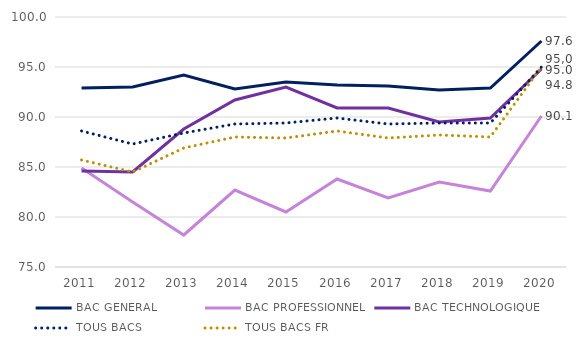
| Category | BAC GENERAL | BAC PROFESSIONNEL | BAC TECHNOLOGIQUE | TOUS BACS | TOUS BACS FR |
|---|---|---|---|---|---|
| 2011 | 92.9 | 84.9 | 84.6 | 88.6 | 85.7 |
| 2012 | 93 | 81.5 | 84.5 | 87.3 | 84.5 |
| 2013 | 94.2 | 78.2 | 88.8 | 88.4 | 86.9 |
| 2014 | 92.8 | 82.7 | 91.7 | 89.3 | 88 |
| 2015 | 93.5 | 80.5 | 93 | 89.4 | 87.9 |
| 2016 | 93.2 | 83.8 | 90.9 | 89.9 | 88.6 |
| 2017 | 93.1 | 81.9 | 90.9 | 89.3 | 87.9 |
| 2018 | 92.7 | 83.5 | 89.5 | 89.4 | 88.2 |
| 2019 | 92.9 | 82.6 | 89.9 | 89.4 | 88 |
| 2020 | 97.6 | 90.1 | 94.8 | 95 | 95 |